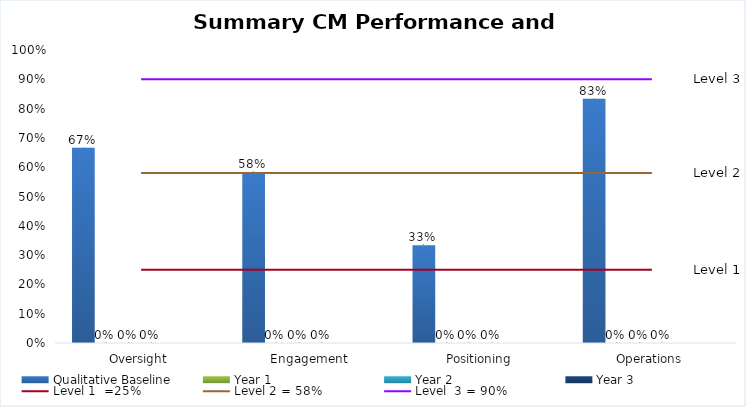
| Category | Qualitative Baseline | Year 1 | Year 2 | Year 3 | empty column |
|---|---|---|---|---|---|
| Oversight | 0.667 | 0 | 0 | 0 |  |
| Engagement | 0.583 | 0 | 0 | 0 |  |
| Positioning | 0.333 | 0 | 0 | 0 |  |
| Operations | 0.833 | 0 | 0 | 0 |  |